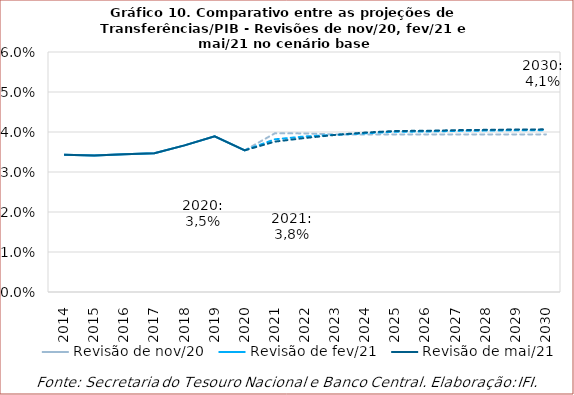
| Category | Revisão de nov/20 | Revisão de fev/21 | Revisão de mai/21 |
|---|---|---|---|
| 2014.0 | 0.034 | 0.034 | 0.034 |
| 2015.0 | 0.034 | 0.034 | 0.034 |
| 2016.0 | 0.034 | 0.034 | 0.034 |
| 2017.0 | 0.035 | 0.035 | 0.035 |
| 2018.0 | 0.037 | 0.037 | 0.037 |
| 2019.0 | 0.039 | 0.039 | 0.039 |
| 2020.0 | 0.035 | 0.035 | 0.035 |
| 2021.0 | 0.04 | 0.038 | 0.038 |
| 2022.0 | 0.04 | 0.039 | 0.039 |
| 2023.0 | 0.039 | 0.039 | 0.039 |
| 2024.0 | 0.039 | 0.04 | 0.04 |
| 2025.0 | 0.039 | 0.04 | 0.04 |
| 2026.0 | 0.039 | 0.04 | 0.04 |
| 2027.0 | 0.039 | 0.04 | 0.04 |
| 2028.0 | 0.039 | 0.04 | 0.041 |
| 2029.0 | 0.039 | 0.04 | 0.041 |
| 2030.0 | 0.039 | 0.04 | 0.041 |